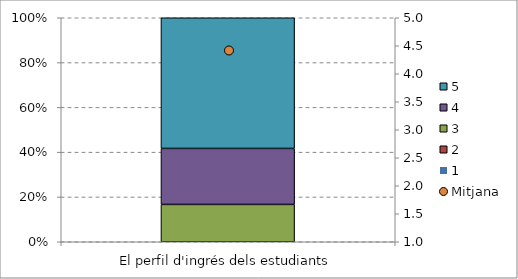
| Category | 1 | 2 | 3 | 4 | 5 |
|---|---|---|---|---|---|
| El perfil d'ingrés dels estudiants | 0 | 0 | 0.167 | 0.25 | 0.583 |